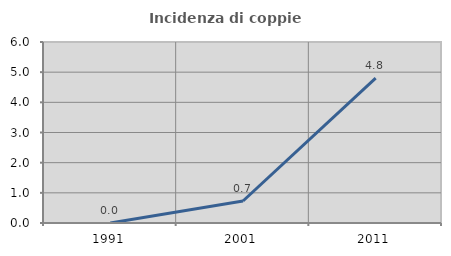
| Category | Incidenza di coppie miste |
|---|---|
| 1991.0 | 0 |
| 2001.0 | 0.73 |
| 2011.0 | 4.803 |